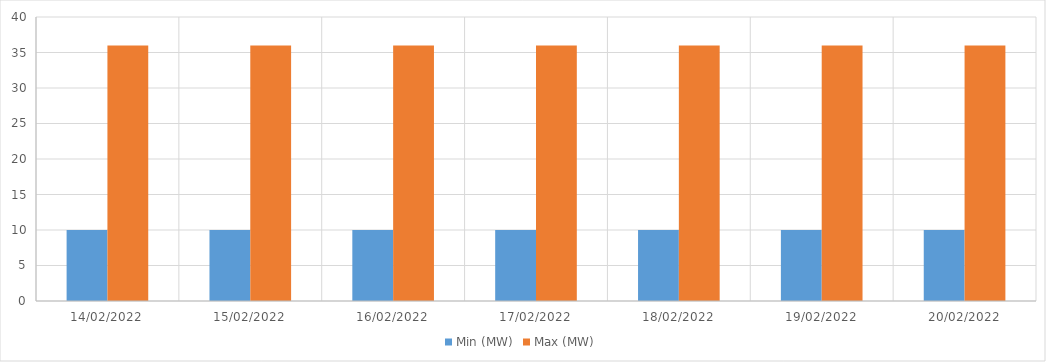
| Category | Min (MW) | Max (MW) |
|---|---|---|
| 14/02/2022 | 10 | 36 |
| 15/02/2022 | 10 | 36 |
| 16/02/2022 | 10 | 36 |
| 17/02/2022 | 10 | 36 |
| 18/02/2022 | 10 | 36 |
| 19/02/2022 | 10 | 36 |
| 20/02/2022 | 10 | 36 |